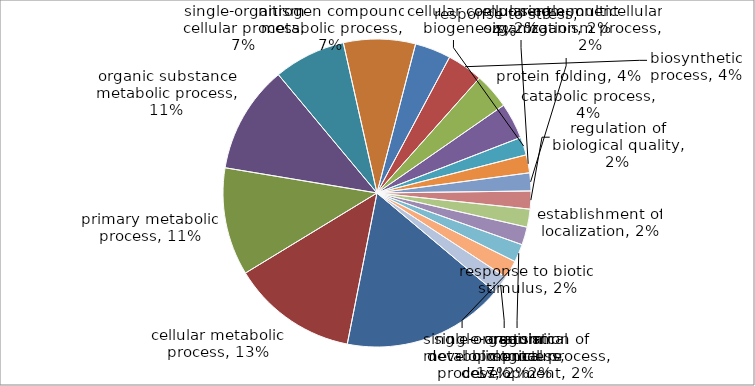
| Category | Series 0 |
|---|---|
| single-organism metabolic process | 9 |
| cellular metabolic process | 7 |
| primary metabolic process | 6 |
| organic substance metabolic process | 6 |
| single-organism cellular process | 4 |
| nitrogen compound metabolic process | 4 |
| response to stress | 2 |
| biosynthetic process | 2 |
| protein folding | 2 |
| catabolic process | 2 |
| cellular component biogenesis | 1 |
| cellular component organization | 1 |
| single-multicellular organism process | 1 |
| regulation of biological quality | 1 |
| establishment of localization | 1 |
| response to biotic stimulus | 1 |
| regulation of biological process | 1 |
| single-organism developmental process | 1 |
| anatomical structure development | 1 |